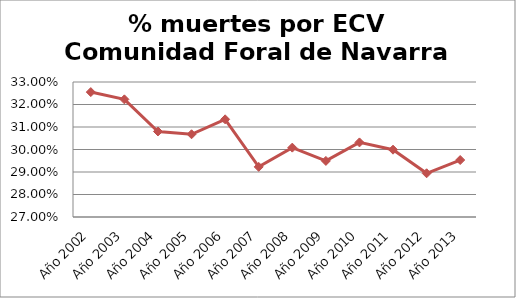
| Category | Series 0 |
|---|---|
| Año 2002 | 0.326 |
| Año 2003 | 0.322 |
| Año 2004 | 0.308 |
| Año 2005 | 0.307 |
| Año 2006 | 0.313 |
| Año 2007 | 0.292 |
| Año 2008 | 0.301 |
| Año 2009 | 0.295 |
| Año 2010 | 0.303 |
| Año 2011 | 0.3 |
| Año 2012 | 0.289 |
| Año 2013 | 0.295 |